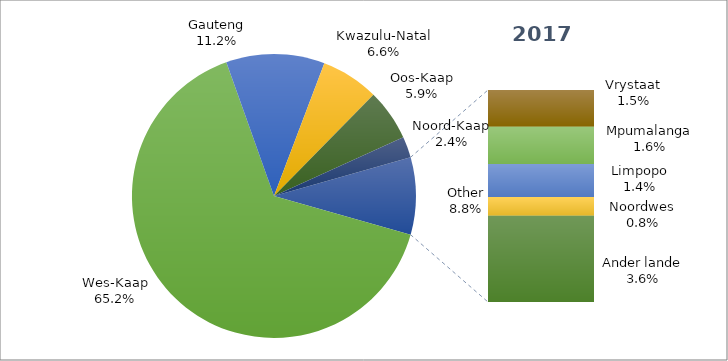
| Category | Series 0 |
|---|---|
| Wes-Kaap | 11817 |
| Gauteng | 2035 |
| Kwazulu-Natal | 1193 |
| Oos-Kaap | 1063 |
| Noord-Kaap | 434 |
| Vrystaat | 276 |
| Mpumalanga | 282 |
| Limpopo | 248 |
| Noordwes | 141 |
| Ander lande | 649 |